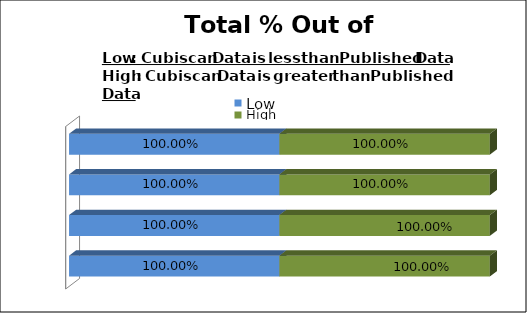
| Category | Low | High |
|---|---|---|
| 0 | 1 | 1 |
| 1 | 1 | 1 |
| 2 | 1 | 1 |
| 3 | 1 | 1 |